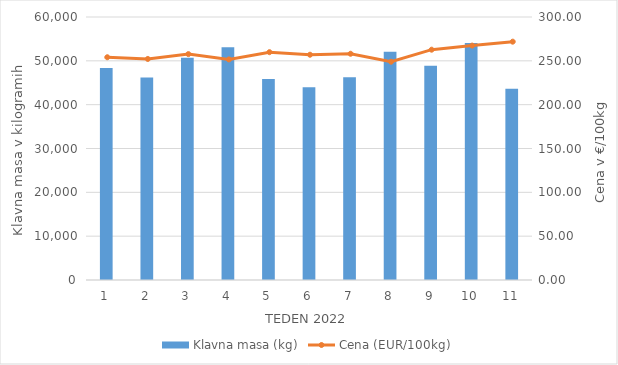
| Category | Klavna masa (kg) |
|---|---|
| 1.0 | 48349 |
| 2.0 | 46187 |
| 3.0 | 50692 |
| 4.0 | 53081 |
| 5.0 | 45844 |
| 6.0 | 43982 |
| 7.0 | 46227 |
| 8.0 | 52099 |
| 9.0 | 48872 |
| 10.0 | 54045 |
| 11.0 | 43645 |